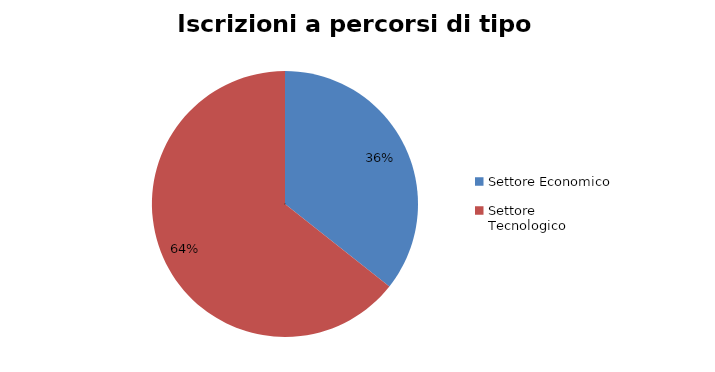
| Category | Series 0 |
|---|---|
| Settore Economico | 4863 |
| Settore Tecnologico | 8781 |